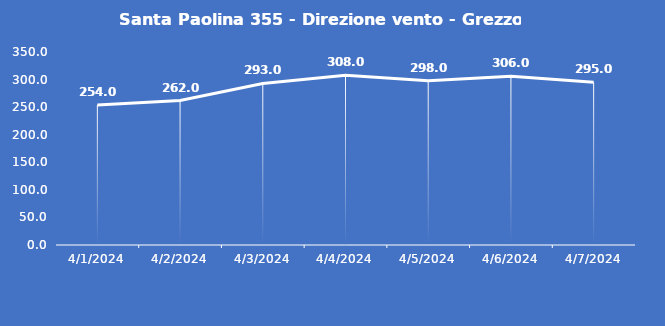
| Category | Santa Paolina 355 - Direzione vento - Grezzo (°N) |
|---|---|
| 4/1/24 | 254 |
| 4/2/24 | 262 |
| 4/3/24 | 293 |
| 4/4/24 | 308 |
| 4/5/24 | 298 |
| 4/6/24 | 306 |
| 4/7/24 | 295 |